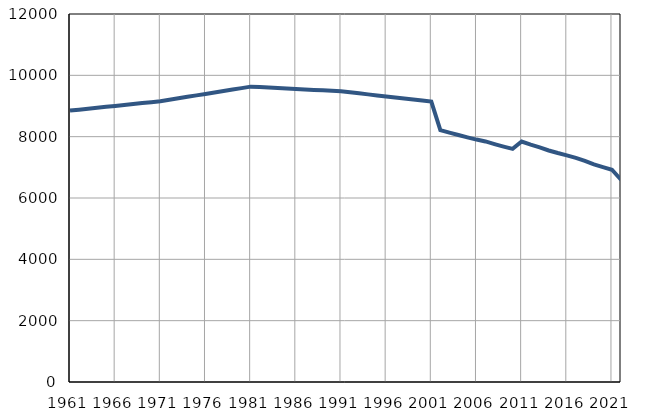
| Category | Population
size |
|---|---|
| 1961.0 | 8850 |
| 1962.0 | 8881 |
| 1963.0 | 8911 |
| 1964.0 | 8941 |
| 1965.0 | 8972 |
| 1966.0 | 9003 |
| 1967.0 | 9034 |
| 1968.0 | 9065 |
| 1969.0 | 9095 |
| 1970.0 | 9125 |
| 1971.0 | 9156 |
| 1972.0 | 9204 |
| 1973.0 | 9251 |
| 1974.0 | 9299 |
| 1975.0 | 9346 |
| 1976.0 | 9394 |
| 1977.0 | 9441 |
| 1978.0 | 9489 |
| 1979.0 | 9536 |
| 1980.0 | 9583 |
| 1981.0 | 9631 |
| 1982.0 | 9616 |
| 1983.0 | 9601 |
| 1984.0 | 9586 |
| 1985.0 | 9570 |
| 1986.0 | 9556 |
| 1987.0 | 9540 |
| 1988.0 | 9524 |
| 1989.0 | 9510 |
| 1990.0 | 9494 |
| 1991.0 | 9480 |
| 1992.0 | 9447 |
| 1993.0 | 9413 |
| 1994.0 | 9379 |
| 1995.0 | 9346 |
| 1996.0 | 9312 |
| 1997.0 | 9279 |
| 1998.0 | 9245 |
| 1999.0 | 9213 |
| 2000.0 | 9178 |
| 2001.0 | 9144 |
| 2002.0 | 8214 |
| 2003.0 | 8132 |
| 2004.0 | 8055 |
| 2005.0 | 7977 |
| 2006.0 | 7905 |
| 2007.0 | 7844 |
| 2008.0 | 7757 |
| 2009.0 | 7677 |
| 2010.0 | 7602 |
| 2011.0 | 7842 |
| 2012.0 | 7738 |
| 2013.0 | 7650 |
| 2014.0 | 7550 |
| 2015.0 | 7466 |
| 2016.0 | 7390 |
| 2017.0 | 7307 |
| 2018.0 | 7210 |
| 2019.0 | 7095 |
| 2020.0 | 7009 |
| 2021.0 | 6921 |
| 2022.0 | 6595 |